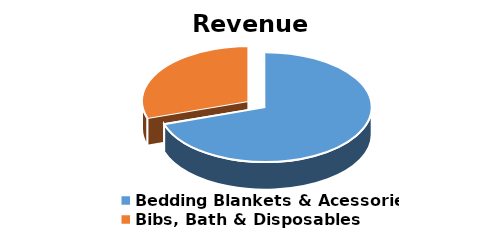
| Category | Series 0 |
|---|---|
| Bedding Blankets & Acessories | 59.02 |
| Bibs, Bath & Disposables | 25.322 |